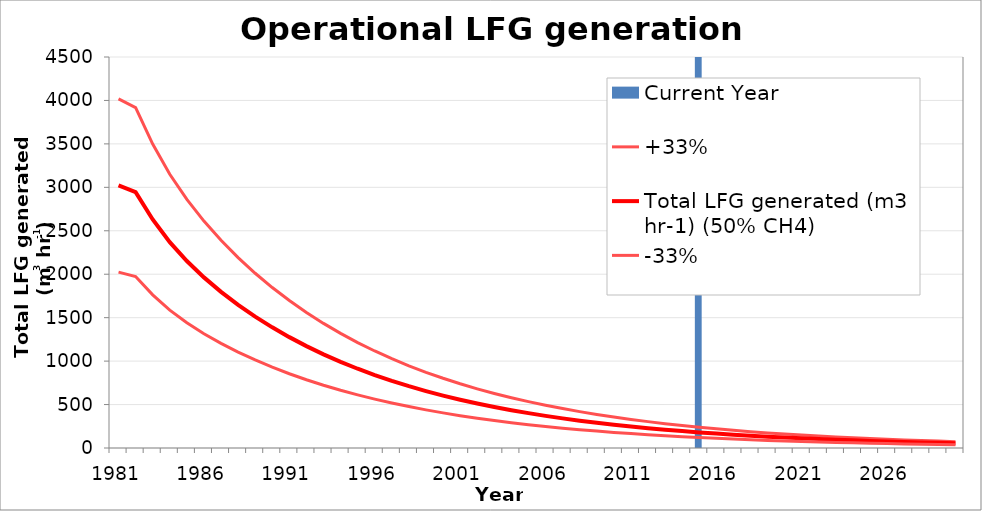
| Category | Current Year |
|---|---|
| 1981.0 | 0 |
| 1982.0 | 0 |
| 1983.0 | 0 |
| 1984.0 | 0 |
| 1985.0 | 0 |
| 1986.0 | 0 |
| 1987.0 | 0 |
| 1988.0 | 0 |
| 1989.0 | 0 |
| 1990.0 | 0 |
| 1991.0 | 0 |
| 1992.0 | 0 |
| 1993.0 | 0 |
| 1994.0 | 0 |
| 1995.0 | 0 |
| 1996.0 | 0 |
| 1997.0 | 0 |
| 1998.0 | 0 |
| 1999.0 | 0 |
| 2000.0 | 0 |
| 2001.0 | 0 |
| 2002.0 | 0 |
| 2003.0 | 0 |
| 2004.0 | 0 |
| 2005.0 | 0 |
| 2006.0 | 0 |
| 2007.0 | 0 |
| 2008.0 | 0 |
| 2009.0 | 0 |
| 2010.0 | 0 |
| 2011.0 | 0 |
| 2012.0 | 0 |
| 2013.0 | 0 |
| 2014.0 | 0 |
| 2015.0 | 1 |
| 2016.0 | 0 |
| 2017.0 | 0 |
| 2018.0 | 0 |
| 2019.0 | 0 |
| 2020.0 | 0 |
| 2021.0 | 0 |
| 2022.0 | 0 |
| 2023.0 | 0 |
| 2024.0 | 0 |
| 2025.0 | 0 |
| 2026.0 | 0 |
| 2027.0 | 0 |
| 2028.0 | 0 |
| 2029.0 | 0 |
| 2030.0 | 0 |